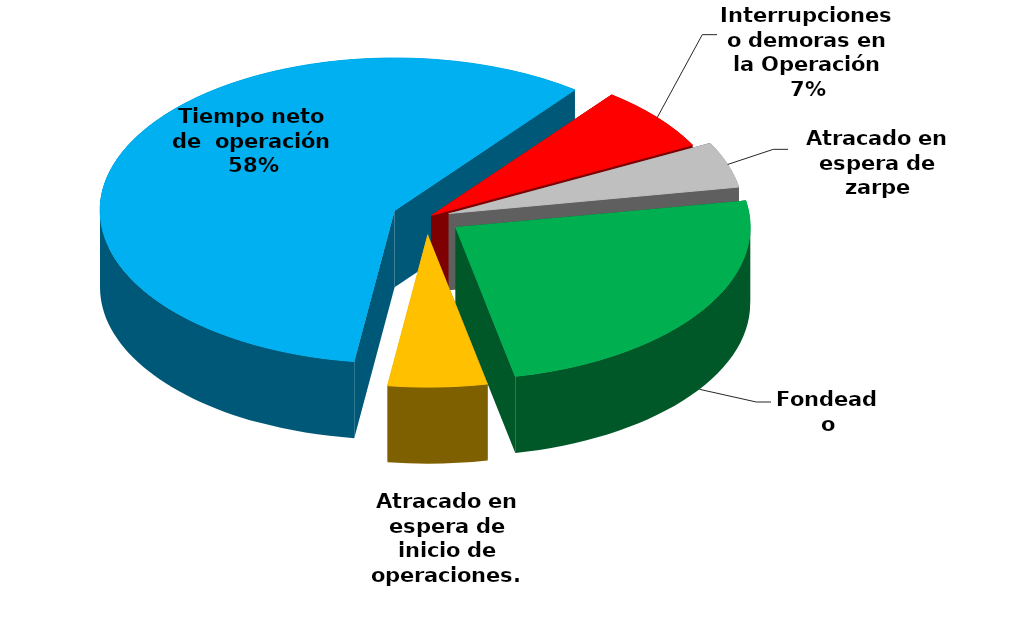
| Category | Series 0 |
|---|---|
| Fondeado | 19965.137 |
| Atracado en espera de inicio de operaciones. | 4421.744 |
| Tiempo neto de  operación | 47444.703 |
| Interrupciones o demoras en la Operación | 5598.57 |
| Atracado en espera de zarpe | 3959.581 |